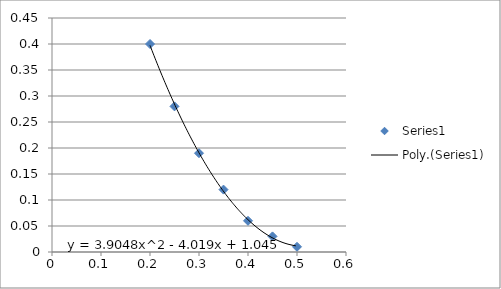
| Category | Series 0 |
|---|---|
| 0.2 | 0.4 |
| 0.25 | 0.28 |
| 0.3 | 0.19 |
| 0.35 | 0.12 |
| 0.4 | 0.06 |
| 0.45 | 0.03 |
| 0.5 | 0.01 |